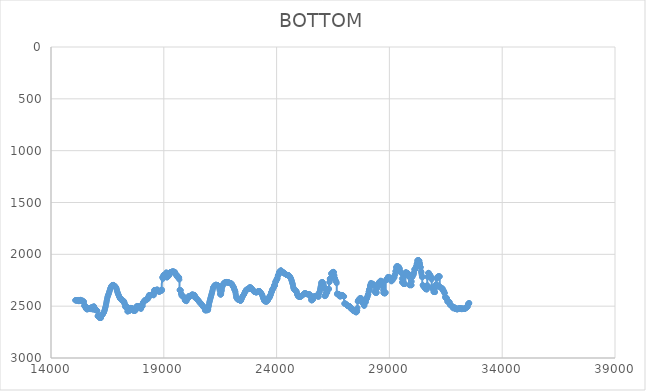
| Category | BOTTOM |
|---|---|
| 15075.3072 | 2442.53 |
| 15082.4409 | 2443.89 |
| 15092.6804 | 2443.94 |
| 15102.9205 | 2443.94 |
| 15113.1605 | 2443.94 |
| 15123.4005 | 2443.94 |
| 15133.6406 | 2443.94 |
| 15143.8806 | 2443.94 |
| 15154.1207 | 2443.94 |
| 15164.3607 | 2442.56 |
| 15174.6007 | 2442.53 |
| 15184.8408 | 2448.04 |
| 15195.0808 | 2446.78 |
| 15205.3209 | 2439.87 |
| 15215.5609 | 2442.47 |
| 15225.8009 | 2445.28 |
| 15236.041 | 2452.23 |
| 15246.281 | 2451.01 |
| 15256.5211 | 2444.09 |
| 15266.7611 | 2443.94 |
| 15277.0011 | 2446.69 |
| 15287.2412 | 2445.38 |
| 15297.4812 | 2445.35 |
| 15307.7213 | 2438.46 |
| 15317.9613 | 2441.06 |
| 15328.2013 | 2446.63 |
| 15338.4414 | 2446.75 |
| 15348.6814 | 2452.26 |
| 15358.9215 | 2446.88 |
| 15369.1615 | 2446.75 |
| 15379.4016 | 2449.51 |
| 15389.6416 | 2445.44 |
| 15399.8816 | 2448.1 |
| 15410.1217 | 2449.54 |
| 15420.3617 | 2453.7 |
| 15430.6018 | 2460.67 |
| 15440.8418 | 2456.7 |
| 15451.0818 | 2456.61 |
| 15461.3219 | 2456.61 |
| 15471.5619 | 2496.52 |
| 15481.802 | 2498.8 |
| 15492.042 | 2493.33 |
| 15502.282 | 2494.58 |
| 15512.5221 | 2494.61 |
| 15522.7621 | 2509.75 |
| 15533.0022 | 2510.1 |
| 15543.2422 | 2516.98 |
| 15553.4822 | 2524.02 |
| 15563.7223 | 2526.93 |
| 15573.9623 | 2526.99 |
| 15584.2024 | 2528.36 |
| 15594.4424 | 2529.77 |
| 15604.6824 | 2532.56 |
| 15614.9225 | 2525.74 |
| 15625.1625 | 2528.33 |
| 15635.4026 | 2522.89 |
| 15645.6426 | 2522.76 |
| 15655.8826 | 2522.76 |
| 15666.1227 | 2520.01 |
| 15676.3627 | 2525.46 |
| 15686.6028 | 2524.2 |
| 15696.8428 | 2522.8 |
| 15707.0828 | 2521.39 |
| 15717.3229 | 2524.11 |
| 15727.5629 | 2525.55 |
| 15737.803 | 2525.58 |
| 15748.043 | 2526.96 |
| 15758.283 | 2528.36 |
| 15768.5231 | 2521.51 |
| 15778.7631 | 2515.85 |
| 15789.0032 | 2510.22 |
| 15799.2432 | 2512.85 |
| 15809.4833 | 2514.29 |
| 15819.7233 | 2514.32 |
| 15829.9633 | 2514.32 |
| 15840.2034 | 2530.84 |
| 15850.4434 | 2531.21 |
| 15860.6835 | 2507.81 |
| 15870.9235 | 2507.28 |
| 15881.1635 | 2519.67 |
| 15891.4036 | 2503.43 |
| 15901.6436 | 2503.06 |
| 15911.8837 | 2503.06 |
| 15922.1237 | 2527.84 |
| 15932.3637 | 2528.4 |
| 15942.6038 | 2536.66 |
| 15952.8438 | 2531.33 |
| 15963.0839 | 2531.21 |
| 15973.3239 | 2531.21 |
| 15983.5639 | 2531.21 |
| 15993.804 | 2533.96 |
| 16004.044 | 2534.03 |
| 16014.2841 | 2538.16 |
| 16024.5241 | 2542.38 |
| 16034.7641 | 2542.47 |
| 16045.0042 | 2542.47 |
| 16055.2442 | 2549.35 |
| 16065.4843 | 2594.94 |
| 16075.7243 | 2595.96 |
| 16085.9643 | 2595.96 |
| 16096.2044 | 2595.96 |
| 16106.4444 | 2598.71 |
| 16116.6845 | 2598.78 |
| 16126.9245 | 2598.78 |
| 16137.1645 | 2600.15 |
| 16147.4046 | 2602.94 |
| 16157.6446 | 2614.01 |
| 16167.8847 | 2614.26 |
| 16178.1247 | 2612.88 |
| 16188.3647 | 2612.85 |
| 16198.6048 | 2612.85 |
| 16208.8448 | 2612.85 |
| 16219.0849 | 2612.85 |
| 16229.3249 | 2592.2 |
| 16239.5649 | 2591.74 |
| 16249.805 | 2591.74 |
| 16260.045 | 2587.61 |
| 16270.2851 | 2586.14 |
| 16280.5251 | 2582.57 |
| 16290.7652 | 2578.95 |
| 16301.0052 | 2575.33 |
| 16311.2452 | 2571.71 |
| 16321.4853 | 2568.09 |
| 16331.7253 | 2564.47 |
| 16341.9654 | 2560.85 |
| 16352.2054 | 2554.8 |
| 16362.4454 | 2548.7 |
| 16372.6855 | 2542.6 |
| 16382.9255 | 2534.21 |
| 16393.1656 | 2525.76 |
| 16403.4056 | 2517.32 |
| 16413.6456 | 2508.87 |
| 16423.8857 | 2500.43 |
| 16434.1257 | 2488.88 |
| 16444.3658 | 2477.27 |
| 16454.6058 | 2465.66 |
| 16464.8458 | 2454.04 |
| 16475.0859 | 2443.12 |
| 16485.3259 | 2432.21 |
| 16495.566 | 2421.3 |
| 16505.806 | 2410.39 |
| 16516.046 | 2404.37 |
| 16526.2861 | 2398.46 |
| 16536.5261 | 2392.55 |
| 16546.7662 | 2386.64 |
| 16557.0062 | 2380.72 |
| 16567.2462 | 2373.71 |
| 16577.4863 | 2366.67 |
| 16587.7263 | 2359.63 |
| 16597.9664 | 2352.25 |
| 16608.2064 | 2344.86 |
| 16618.4464 | 2337.47 |
| 16628.6865 | 2330.08 |
| 16638.9265 | 2325.33 |
| 16649.1666 | 2320.64 |
| 16659.4066 | 2315.95 |
| 16669.6467 | 2311.26 |
| 16679.8867 | 2306.56 |
| 16690.1267 | 2301.87 |
| 16700.3668 | 2300.79 |
| 16710.6068 | 2299.78 |
| 16720.8469 | 2298.77 |
| 16731.0869 | 2297.77 |
| 16741.3269 | 2296.76 |
| 16751.567 | 2295.76 |
| 16761.807 | 2294.75 |
| 16772.0471 | 2296.45 |
| 16782.2871 | 2298.21 |
| 16792.5271 | 2299.97 |
| 16802.7672 | 2301.73 |
| 16813.0072 | 2303.49 |
| 16823.2473 | 2305.25 |
| 16833.4873 | 2307.01 |
| 16843.7273 | 2308.77 |
| 16853.9674 | 2311.84 |
| 16864.2074 | 2314.93 |
| 16874.4475 | 2318.03 |
| 16884.6875 | 2321.13 |
| 16894.9275 | 2324.22 |
| 16905.1676 | 2332.55 |
| 16915.4076 | 2341 |
| 16925.6477 | 2349.45 |
| 16935.8877 | 2356.97 |
| 16946.1277 | 2364.48 |
| 16956.3678 | 2371.99 |
| 16966.6078 | 2377.43 |
| 16976.8479 | 2382.82 |
| 16987.0879 | 2388.22 |
| 16997.3279 | 2393.62 |
| 17007.568 | 2399.01 |
| 17017.808 | 2404.41 |
| 17028.0481 | 2409.21 |
| 17038.2881 | 2413.99 |
| 17048.5282 | 2418.78 |
| 17058.7682 | 2423.57 |
| 17069.0082 | 2428.35 |
| 17079.2483 | 2428.45 |
| 17089.4883 | 2428.45 |
| 17099.7284 | 2428.45 |
| 17109.9684 | 2428.45 |
| 17120.2084 | 2428.45 |
| 17130.4485 | 2442.23 |
| 17140.6885 | 2442.53 |
| 17150.9286 | 2446.66 |
| 17161.1686 | 2445.38 |
| 17171.4086 | 2445.35 |
| 17181.6487 | 2445.35 |
| 17191.8887 | 2445.35 |
| 17202.1288 | 2448.1 |
| 17212.3688 | 2449.54 |
| 17222.6088 | 2449.57 |
| 17232.8489 | 2467.47 |
| 17243.0889 | 2467.87 |
| 17253.329 | 2459.6 |
| 17263.569 | 2477.33 |
| 17273.809 | 2477.72 |
| 17284.0491 | 2498.38 |
| 17294.2891 | 2508.48 |
| 17304.5292 | 2508.69 |
| 17314.7692 | 2507.31 |
| 17325.0092 | 2507.28 |
| 17335.2493 | 2508.66 |
| 17345.4893 | 2504.56 |
| 17355.7294 | 2512.73 |
| 17365.9694 | 2512.91 |
| 17376.2094 | 2504.65 |
| 17386.4495 | 2549.92 |
| 17396.6895 | 2550.92 |
| 17406.9296 | 2549.54 |
| 17417.1696 | 2548.13 |
| 17427.4097 | 2545.35 |
| 17437.6497 | 2545.29 |
| 17447.8897 | 2545.29 |
| 17458.1298 | 2546.66 |
| 17468.3698 | 2546.69 |
| 17478.6099 | 2524.66 |
| 17488.8499 | 2522.79 |
| 17499.0899 | 2521.39 |
| 17509.33 | 2519.98 |
| 17519.57 | 2519.95 |
| 17529.8101 | 2517.19 |
| 17540.0501 | 2517.13 |
| 17550.2901 | 2517.13 |
| 17560.5302 | 2518.51 |
| 17570.7702 | 2519.92 |
| 17581.0103 | 2519.95 |
| 17591.2503 | 2519.95 |
| 17601.4903 | 2522.7 |
| 17611.7304 | 2522.76 |
| 17621.9704 | 2537.92 |
| 17632.2105 | 2538.25 |
| 17642.4505 | 2538.25 |
| 17652.6905 | 2542.38 |
| 17662.9306 | 2543.85 |
| 17673.1706 | 2543.88 |
| 17683.4107 | 2543.88 |
| 17693.6507 | 2545.26 |
| 17703.8907 | 2545.29 |
| 17714.1308 | 2539.78 |
| 17724.3708 | 2541.03 |
| 17734.6109 | 2541.06 |
| 17744.8509 | 2542.44 |
| 17755.091 | 2512.17 |
| 17765.331 | 2511.5 |
| 17775.571 | 2511.5 |
| 17785.8111 | 2508.75 |
| 17796.0511 | 2508.69 |
| 17806.2912 | 2497.67 |
| 17816.5312 | 2509.83 |
| 17826.7712 | 2510.1 |
| 17837.0113 | 2501.83 |
| 17847.2513 | 2498.9 |
| 17857.4914 | 2498.84 |
| 17867.7314 | 2498.84 |
| 17877.9714 | 2501.59 |
| 17888.2115 | 2498.9 |
| 17898.4515 | 2498.84 |
| 17908.6916 | 2501.59 |
| 17918.9316 | 2514.05 |
| 17929.1716 | 2515.7 |
| 17939.4117 | 2515.73 |
| 17949.6517 | 2517.1 |
| 17959.8918 | 2519.89 |
| 17970.1318 | 2519.95 |
| 17980.3718 | 2519.95 |
| 17990.6119 | 2526.84 |
| 18000.8519 | 2507.7 |
| 18011.092 | 2508.66 |
| 18021.332 | 2505.93 |
| 18031.572 | 2498.98 |
| 18041.8121 | 2501.59 |
| 18052.0521 | 2501.65 |
| 18062.2922 | 2496.14 |
| 18072.5322 | 2465.71 |
| 18082.7723 | 2462.3 |
| 18093.0123 | 2464.99 |
| 18103.2523 | 2465.05 |
| 18113.4924 | 2458.16 |
| 18123.7324 | 2452.5 |
| 18133.9725 | 2451.01 |
| 18144.2125 | 2445.47 |
| 18154.4525 | 2443.97 |
| 18164.6926 | 2443.94 |
| 18174.9326 | 2441.18 |
| 18185.1727 | 2441.12 |
| 18195.4127 | 2441.12 |
| 18205.6527 | 2436.99 |
| 18215.8928 | 2436.9 |
| 18226.1328 | 2436.9 |
| 18236.3729 | 2436.9 |
| 18246.6129 | 2436.9 |
| 18256.8529 | 2434.14 |
| 18267.093 | 2434.08 |
| 18277.333 | 2432.71 |
| 18287.5731 | 2432.68 |
| 18297.8131 | 2421.65 |
| 18308.0531 | 2410.39 |
| 18318.2932 | 2412.91 |
| 18328.5332 | 2412.97 |
| 18338.7733 | 2395.06 |
| 18349.0133 | 2393.29 |
| 18359.2533 | 2394.64 |
| 18369.4934 | 2394.67 |
| 18379.7334 | 2394.67 |
| 18389.9735 | 2397.43 |
| 18400.2135 | 2397.49 |
| 18410.4536 | 2398.86 |
| 18420.6936 | 2392.01 |
| 18430.9336 | 2391.86 |
| 18441.1737 | 2393.23 |
| 18451.4137 | 2390.51 |
| 18461.6538 | 2390.45 |
| 18471.8938 | 2389.07 |
| 18482.1338 | 2389.04 |
| 18492.3739 | 2390.42 |
| 18502.6139 | 2390.45 |
| 18512.854 | 2390.45 |
| 18523.094 | 2390.45 |
| 18533.334 | 2389.07 |
| 18543.5741 | 2394.55 |
| 18553.8141 | 2394.67 |
| 18564.0542 | 2362.98 |
| 18574.2942 | 2345.76 |
| 18584.5342 | 2345.41 |
| 18594.7743 | 2345.41 |
| 18605.0143 | 2345.41 |
| 18615.2544 | 2344.03 |
| 18625.4944 | 2344 |
| 18635.7344 | 2359.16 |
| 18645.9745 | 2359.48 |
| 18656.2145 | 2359.48 |
| 18666.4546 | 2356.73 |
| 18676.6946 | 2341.51 |
| 18686.9347 | 2341.18 |
| 18697.1747 | 2342.56 |
| 18707.4147 | 2342.59 |
| 18717.6548 | 2341.21 |
| 18727.8948 | 2341.18 |
| 18738.1349 | 2354.96 |
| 18748.3749 | 2356.64 |
| 18758.6149 | 2353.91 |
| 18768.855 | 2353.85 |
| 18779.095 | 2353.85 |
| 18789.3351 | 2360.74 |
| 18799.5751 | 2360.89 |
| 18809.8151 | 2360.89 |
| 18820.0552 | 2356.75 |
| 18830.2952 | 2352.53 |
| 18840.5353 | 2352.44 |
| 18850.7753 | 2352.44 |
| 18861.0153 | 2348.31 |
| 18871.2554 | 2348.22 |
| 18881.4954 | 2348.22 |
| 18891.7355 | 2349.6 |
| 18901.9755 | 2349.63 |
| 18912.2155 | 2349.63 |
| 18922.4556 | 2339.98 |
| 18932.6956 | 2224.01 |
| 18942.9357 | 2221.53 |
| 18953.1757 | 2221.53 |
| 18963.4158 | 2236.69 |
| 18973.6558 | 2210.83 |
| 18983.8958 | 2200.63 |
| 18994.1359 | 2200.42 |
| 19004.3759 | 2200.42 |
| 19014.616 | 2199.04 |
| 19024.856 | 2199.01 |
| 19035.096 | 2200.39 |
| 19045.3361 | 2208.69 |
| 19055.5761 | 2208.87 |
| 19065.8162 | 2208.87 |
| 19076.0562 | 2211.62 |
| 19086.2962 | 2211.68 |
| 19096.5363 | 2211.68 |
| 19106.7763 | 2175.85 |
| 19117.0164 | 2175.08 |
| 19127.2564 | 2220.56 |
| 19137.4964 | 2221.53 |
| 19147.7365 | 2221.53 |
| 19157.9765 | 2221.53 |
| 19168.2166 | 2211.89 |
| 19178.4566 | 2210.3 |
| 19188.6966 | 2210.27 |
| 19198.9367 | 2210.27 |
| 19209.1767 | 2210.27 |
| 19219.4168 | 2200.63 |
| 19229.6568 | 2203.18 |
| 19239.8969 | 2203.24 |
| 19250.1369 | 2178.43 |
| 19260.3769 | 2177.9 |
| 19270.617 | 2176.52 |
| 19280.857 | 2175.11 |
| 19291.0971 | 2173.71 |
| 19301.3371 | 2173.68 |
| 19311.5771 | 2173.68 |
| 19321.8172 | 2172.3 |
| 19332.0572 | 2172.27 |
| 19342.2973 | 2169.51 |
| 19352.5373 | 2168.07 |
| 19362.7773 | 2168.05 |
| 19373.0174 | 2166.67 |
| 19383.2574 | 2166.64 |
| 19393.4975 | 2166.64 |
| 19403.7375 | 2166.64 |
| 19413.9775 | 2166.64 |
| 19424.2176 | 2166.64 |
| 19434.4576 | 2168.02 |
| 19444.6977 | 2168.05 |
| 19454.9377 | 2168.05 |
| 19465.1777 | 2168.05 |
| 19475.4178 | 2170.8 |
| 19485.6578 | 2170.86 |
| 19495.8979 | 2170.86 |
| 19506.1379 | 2192.92 |
| 19516.378 | 2190.63 |
| 19526.618 | 2191.95 |
| 19536.858 | 2191.97 |
| 19547.0981 | 2194.73 |
| 19557.3381 | 2194.79 |
| 19567.5782 | 2196.17 |
| 19577.8182 | 2214.12 |
| 19588.0582 | 2213.12 |
| 19598.2983 | 2213.09 |
| 19608.5383 | 2213.09 |
| 19618.7784 | 2214.47 |
| 19629.0184 | 2214.5 |
| 19639.2584 | 2214.5 |
| 19649.4985 | 2220.01 |
| 19659.7385 | 2233.91 |
| 19669.9786 | 2223.18 |
| 19680.2186 | 2222.94 |
| 19690.4586 | 2243.62 |
| 19700.6987 | 2343.31 |
| 19710.9387 | 2345.41 |
| 19721.1788 | 2346.78 |
| 19731.4188 | 2346.81 |
| 19741.6588 | 2346.81 |
| 19751.8989 | 2348.19 |
| 19762.1389 | 2378.55 |
| 19772.379 | 2379.19 |
| 19782.619 | 2395.73 |
| 19792.8591 | 2396.08 |
| 19803.0991 | 2393.32 |
| 19813.3391 | 2402.91 |
| 19823.5792 | 2403.12 |
| 19833.8192 | 2401.74 |
| 19844.0593 | 2401.71 |
| 19854.2993 | 2404.47 |
| 19864.5393 | 2411.42 |
| 19874.7794 | 2411.56 |
| 19885.0194 | 2411.56 |
| 19895.2595 | 2415.7 |
| 19905.4995 | 2414.41 |
| 19915.7395 | 2422.65 |
| 19925.9796 | 2435.23 |
| 19936.2196 | 2443.76 |
| 19946.4597 | 2443.94 |
| 19956.6997 | 2443.94 |
| 19966.9397 | 2445.32 |
| 19977.1798 | 2448.1 |
| 19987.4198 | 2448.16 |
| 19997.6599 | 2448.16 |
| 20007.8999 | 2452.3 |
| 20018.14 | 2424.81 |
| 20028.38 | 2424.23 |
| 20038.62 | 2424.23 |
| 20048.8601 | 2424.23 |
| 20059.1001 | 2424.23 |
| 20069.3402 | 2424.23 |
| 20079.5802 | 2420.1 |
| 20089.8202 | 2420.01 |
| 20100.0603 | 2420.01 |
| 20110.3003 | 2402.09 |
| 20120.5404 | 2401.71 |
| 20130.7804 | 2401.71 |
| 20141.0204 | 2404.47 |
| 20151.2605 | 2404.53 |
| 20161.5005 | 2403.15 |
| 20171.7406 | 2403.12 |
| 20181.9806 | 2401.74 |
| 20192.2206 | 2401.71 |
| 20202.4607 | 2400.33 |
| 20212.7007 | 2396.17 |
| 20222.9408 | 2390.56 |
| 20233.1808 | 2390.45 |
| 20243.4208 | 2389.07 |
| 20253.6609 | 2389.04 |
| 20263.9009 | 2390.42 |
| 20274.141 | 2390.45 |
| 20284.381 | 2389.07 |
| 20294.6211 | 2389.04 |
| 20304.8611 | 2389.04 |
| 20315.1011 | 2393.18 |
| 20325.3412 | 2393.26 |
| 20335.5812 | 2391.89 |
| 20345.8213 | 2391.86 |
| 20356.0613 | 2391.86 |
| 20366.3013 | 2415.3 |
| 20376.5414 | 2397.86 |
| 20386.7814 | 2408.52 |
| 20397.0215 | 2410.13 |
| 20407.2615 | 2410.16 |
| 20417.5015 | 2421.19 |
| 20427.7416 | 2421.42 |
| 20437.9816 | 2421.42 |
| 20448.2217 | 2429.69 |
| 20458.4617 | 2429.86 |
| 20468.7017 | 2429.86 |
| 20478.9418 | 2436.76 |
| 20489.1818 | 2436.9 |
| 20499.4219 | 2438.28 |
| 20509.6619 | 2443.82 |
| 20519.902 | 2443.94 |
| 20530.142 | 2443.94 |
| 20540.382 | 2445.32 |
| 20550.6221 | 2453.62 |
| 20560.8621 | 2457.93 |
| 20571.1022 | 2458.01 |
| 20581.3422 | 2458.01 |
| 20591.5822 | 2466.29 |
| 20601.8223 | 2466.46 |
| 20612.0623 | 2466.46 |
| 20622.3024 | 2466.46 |
| 20632.5424 | 2473.35 |
| 20642.7824 | 2473.5 |
| 20653.0225 | 2477.64 |
| 20663.2625 | 2477.72 |
| 20673.5026 | 2481.86 |
| 20683.7426 | 2487.46 |
| 20693.9826 | 2488.95 |
| 20704.2227 | 2488.98 |
| 20714.4627 | 2497.26 |
| 20724.7028 | 2500.19 |
| 20734.9428 | 2500.24 |
| 20745.1828 | 2507.14 |
| 20755.4229 | 2507.28 |
| 20765.6629 | 2507.28 |
| 20775.903 | 2512.8 |
| 20786.143 | 2511.53 |
| 20796.3831 | 2511.5 |
| 20806.6231 | 2511.5 |
| 20816.8631 | 2517.02 |
| 20827.1032 | 2539.2 |
| 20837.3432 | 2539.66 |
| 20847.5833 | 2539.66 |
| 20857.8233 | 2539.66 |
| 20868.0633 | 2539.66 |
| 20878.3034 | 2538.28 |
| 20888.5434 | 2538.25 |
| 20898.7835 | 2538.25 |
| 20909.0235 | 2538.25 |
| 20919.2635 | 2538.25 |
| 20929.5036 | 2538.25 |
| 20939.7436 | 2538.25 |
| 20949.9837 | 2538.25 |
| 20960.2237 | 2538.25 |
| 20970.4637 | 2528.59 |
| 20980.7038 | 2509.09 |
| 20990.9438 | 2499.03 |
| 21001.1839 | 2489.18 |
| 21011.4239 | 2471.05 |
| 21021.664 | 2462.06 |
| 21031.904 | 2453.27 |
| 21042.144 | 2444.47 |
| 21052.3841 | 2435.67 |
| 21062.6241 | 2427.56 |
| 21072.8642 | 2419.47 |
| 21083.1042 | 2411.37 |
| 21093.3442 | 2403.28 |
| 21103.5843 | 2395.07 |
| 21113.8243 | 2386.86 |
| 21124.0644 | 2378.65 |
| 21134.3044 | 2370.44 |
| 21144.5444 | 2362.23 |
| 21154.7845 | 2354.02 |
| 21165.0245 | 2343.28 |
| 21175.2646 | 2332.49 |
| 21185.5046 | 2321.69 |
| 21195.7446 | 2318.26 |
| 21205.9847 | 2314.97 |
| 21216.2247 | 2311.69 |
| 21226.4648 | 2308.4 |
| 21236.7048 | 2305.12 |
| 21246.9449 | 2301.84 |
| 21257.1849 | 2300.11 |
| 21267.4249 | 2298.42 |
| 21277.665 | 2296.74 |
| 21287.905 | 2295.05 |
| 21298.1451 | 2293.36 |
| 21308.3851 | 2293.84 |
| 21318.6251 | 2294.37 |
| 21328.8652 | 2294.9 |
| 21339.1052 | 2295.42 |
| 21349.3453 | 2295.95 |
| 21359.5853 | 2296.48 |
| 21369.8253 | 2297.01 |
| 21380.0654 | 2297.54 |
| 21390.3054 | 2299.39 |
| 21400.5455 | 2301.26 |
| 21410.7855 | 2303.14 |
| 21421.0255 | 2306.28 |
| 21431.2656 | 2309.45 |
| 21441.5056 | 2312.61 |
| 21451.7457 | 2315.78 |
| 21461.9857 | 2331.02 |
| 21472.2258 | 2342.36 |
| 21482.4658 | 2353.62 |
| 21492.7058 | 2378.68 |
| 21502.9459 | 2386.08 |
| 21513.1859 | 2387.61 |
| 21523.426 | 2387.63 |
| 21533.666 | 2387.63 |
| 21543.906 | 2380.74 |
| 21554.1461 | 2358.53 |
| 21564.3861 | 2351.18 |
| 21574.6262 | 2338.62 |
| 21584.8662 | 2320.43 |
| 21595.1062 | 2310.41 |
| 21605.3463 | 2300.56 |
| 21615.5863 | 2301.74 |
| 21625.8264 | 2290.73 |
| 21636.0664 | 2290.51 |
| 21646.3065 | 2283.61 |
| 21656.5465 | 2280.71 |
| 21666.7865 | 2280.65 |
| 21677.0266 | 2275.14 |
| 21687.2666 | 2273.64 |
| 21697.5067 | 2272.24 |
| 21707.7467 | 2272.21 |
| 21717.9867 | 2272.21 |
| 21728.2268 | 2271.75 |
| 21738.4668 | 2271.28 |
| 21748.7069 | 2270.81 |
| 21758.9469 | 2268.73 |
| 21769.1869 | 2266.62 |
| 21779.427 | 2266.58 |
| 21789.667 | 2267.96 |
| 21799.9071 | 2269.37 |
| 21810.1471 | 2269.85 |
| 21820.3871 | 2270.32 |
| 21830.6272 | 2270.79 |
| 21840.8672 | 2272.18 |
| 21851.1073 | 2272.21 |
| 21861.3473 | 2272.21 |
| 21871.5874 | 2272.21 |
| 21881.8274 | 2272.21 |
| 21892.0674 | 2273.59 |
| 21902.3075 | 2274.08 |
| 21912.5475 | 2274.55 |
| 21922.7876 | 2275.01 |
| 21933.0276 | 2276.17 |
| 21943.2676 | 2277.35 |
| 21953.5077 | 2278.52 |
| 21963.7477 | 2279.69 |
| 21973.9878 | 2280.87 |
| 21984.2278 | 2282.04 |
| 21994.4678 | 2282.06 |
| 22004.7079 | 2282.06 |
| 22014.9479 | 2286.2 |
| 22025.188 | 2290.42 |
| 22035.428 | 2294.65 |
| 22045.668 | 2299.56 |
| 22055.9081 | 2304.49 |
| 22066.1481 | 2311.48 |
| 22076.3882 | 2311.62 |
| 22086.6282 | 2311.62 |
| 22096.8683 | 2317.14 |
| 22107.1083 | 2322.77 |
| 22117.3483 | 2330.47 |
| 22127.5884 | 2338.21 |
| 22137.8284 | 2343.2 |
| 22148.0685 | 2348.12 |
| 22158.3085 | 2353.05 |
| 22168.5485 | 2357.98 |
| 22178.7886 | 2369.11 |
| 22189.0286 | 2385.89 |
| 22199.2687 | 2399.33 |
| 22209.5087 | 2412.71 |
| 22219.7487 | 2417.11 |
| 22229.9888 | 2421.33 |
| 22240.2288 | 2425.56 |
| 22250.4689 | 2428.86 |
| 22260.7089 | 2432.14 |
| 22270.949 | 2435.43 |
| 22281.189 | 2434.8 |
| 22291.429 | 2434.1 |
| 22301.6691 | 2435.29 |
| 22311.9091 | 2436.52 |
| 22322.1492 | 2437.76 |
| 22332.3892 | 2438.99 |
| 22342.6292 | 2440.22 |
| 22352.8693 | 2441.45 |
| 22363.1093 | 2442.68 |
| 22373.3494 | 2443.91 |
| 22383.5894 | 2444.97 |
| 22393.8294 | 2446.03 |
| 22404.0695 | 2447.08 |
| 22414.3095 | 2448.14 |
| 22424.5496 | 2442.64 |
| 22434.7896 | 2437.01 |
| 22445.0296 | 2431.38 |
| 22455.2697 | 2425.75 |
| 22465.5097 | 2420.12 |
| 22475.7498 | 2413.8 |
| 22485.9898 | 2407.47 |
| 22496.2299 | 2404.19 |
| 22506.4699 | 2400.97 |
| 22516.7099 | 2397.75 |
| 22526.95 | 2394.53 |
| 22537.19 | 2391.32 |
| 22547.4301 | 2388.1 |
| 22557.6701 | 2384.88 |
| 22567.9101 | 2379.3 |
| 22578.1502 | 2373.67 |
| 22588.3902 | 2368.04 |
| 22598.6303 | 2362.41 |
| 22608.8703 | 2358.5 |
| 22619.1103 | 2354.63 |
| 22629.3504 | 2350.76 |
| 22639.5904 | 2346.89 |
| 22649.8305 | 2344.51 |
| 22660.0705 | 2342.17 |
| 22670.3106 | 2339.82 |
| 22680.5506 | 2339.22 |
| 22690.7906 | 2338.66 |
| 22701.0307 | 2338.1 |
| 22711.2707 | 2337.53 |
| 22721.5108 | 2336.97 |
| 22731.7508 | 2335.92 |
| 22741.9908 | 2334.87 |
| 22752.2309 | 2333.81 |
| 22762.4709 | 2332.76 |
| 22772.711 | 2328.6 |
| 22782.951 | 2324.37 |
| 22793.191 | 2320.15 |
| 22803.4311 | 2319.79 |
| 22813.6711 | 2319.51 |
| 22823.9112 | 2319.23 |
| 22834.1512 | 2318.95 |
| 22844.3912 | 2318.67 |
| 22854.6313 | 2321.19 |
| 22864.8713 | 2323.77 |
| 22875.1114 | 2326.35 |
| 22885.3514 | 2328.93 |
| 22895.5915 | 2331.51 |
| 22905.8315 | 2334.09 |
| 22916.0715 | 2336.63 |
| 22926.3116 | 2339.16 |
| 22936.5516 | 2341.7 |
| 22946.7917 | 2344.23 |
| 22957.0317 | 2346.76 |
| 22967.2717 | 2350.49 |
| 22977.5118 | 2354.25 |
| 22987.7518 | 2358 |
| 22997.9919 | 2358.76 |
| 23008.2319 | 2359.47 |
| 23018.4719 | 2360.17 |
| 23028.712 | 2360.88 |
| 23038.952 | 2361.58 |
| 23049.1921 | 2362.28 |
| 23059.4321 | 2363.4 |
| 23069.6722 | 2364.53 |
| 23079.9122 | 2365.65 |
| 23090.1522 | 2366.78 |
| 23100.3923 | 2367.91 |
| 23110.6323 | 2366.55 |
| 23120.8724 | 2365.14 |
| 23131.1124 | 2363.73 |
| 23141.3524 | 2362.32 |
| 23151.5925 | 2360.92 |
| 23161.8325 | 2359.51 |
| 23172.0726 | 2358.1 |
| 23182.3126 | 2356.69 |
| 23192.5526 | 2355.29 |
| 23202.7927 | 2355.26 |
| 23213.0327 | 2355.26 |
| 23223.2728 | 2355.26 |
| 23233.5128 | 2355.26 |
| 23243.7529 | 2355.26 |
| 23253.9929 | 2358.17 |
| 23264.2329 | 2361.14 |
| 23274.473 | 2364.12 |
| 23284.713 | 2367.09 |
| 23294.9531 | 2370.06 |
| 23305.1931 | 2373.03 |
| 23315.4331 | 2376 |
| 23325.6732 | 2378.97 |
| 23335.9132 | 2381.95 |
| 23346.1533 | 2386.14 |
| 23356.3933 | 2390.37 |
| 23366.6333 | 2394.59 |
| 23376.8734 | 2402.49 |
| 23387.1134 | 2410.47 |
| 23397.3535 | 2418.45 |
| 23407.5935 | 2422.28 |
| 23417.8335 | 2426.04 |
| 23428.0736 | 2429.79 |
| 23438.3136 | 2438.14 |
| 23448.5537 | 2446.59 |
| 23458.7937 | 2450.89 |
| 23469.0338 | 2450.98 |
| 23479.2738 | 2452.36 |
| 23489.5138 | 2451 |
| 23499.7539 | 2452.36 |
| 23509.9939 | 2455.14 |
| 23520.234 | 2455.2 |
| 23530.474 | 2453.82 |
| 23540.714 | 2455.17 |
| 23550.9541 | 2452.44 |
| 23561.1941 | 2455.14 |
| 23571.4342 | 2455.2 |
| 23581.6742 | 2440.01 |
| 23591.9142 | 2438.34 |
| 23602.1543 | 2436.93 |
| 23612.3943 | 2443.8 |
| 23622.6344 | 2441.18 |
| 23632.8744 | 2434.22 |
| 23643.1145 | 2428.56 |
| 23653.3545 | 2427.07 |
| 23663.5945 | 2411.86 |
| 23673.8346 | 2411.56 |
| 23684.0746 | 2410.18 |
| 23694.3147 | 2410.16 |
| 23704.5547 | 2412.92 |
| 23714.7947 | 2393.64 |
| 23725.0348 | 2397.41 |
| 23735.2748 | 2390.58 |
| 23745.5149 | 2384.93 |
| 23755.7549 | 2365.49 |
| 23765.9949 | 2367.87 |
| 23776.235 | 2363.79 |
| 23786.475 | 2363.7 |
| 23796.7151 | 2341.62 |
| 23806.9551 | 2346.7 |
| 23817.1952 | 2342.67 |
| 23827.4352 | 2335.69 |
| 23837.6752 | 2334.17 |
| 23847.9153 | 2325.86 |
| 23858.1553 | 2325.7 |
| 23868.3954 | 2321.56 |
| 23878.6354 | 2314.57 |
| 23888.8754 | 2297.87 |
| 23899.1155 | 2300.31 |
| 23909.3555 | 2301.74 |
| 23919.5956 | 2299.01 |
| 23929.8356 | 2300.33 |
| 23940.0756 | 2264.47 |
| 23950.3157 | 2266.52 |
| 23960.5557 | 2266.58 |
| 23970.7958 | 2262.44 |
| 23981.0358 | 2256.83 |
| 23991.2759 | 2242.92 |
| 24001.5159 | 2248.17 |
| 24011.7559 | 2244.14 |
| 24021.996 | 2234.39 |
| 24032.236 | 2227.3 |
| 24042.4761 | 2232.69 |
| 24052.7161 | 2207.94 |
| 24062.9561 | 2201.94 |
| 24073.1962 | 2199.07 |
| 24083.4362 | 2197.63 |
| 24093.6763 | 2197.61 |
| 24103.9163 | 2175.51 |
| 24114.1563 | 2170.94 |
| 24124.3964 | 2169.48 |
| 24134.6364 | 2174.98 |
| 24144.8765 | 2168.18 |
| 24155.1165 | 2161.14 |
| 24165.3566 | 2158.25 |
| 24175.5966 | 2156.81 |
| 24185.8366 | 2156.78 |
| 24196.0767 | 2155.4 |
| 24206.3167 | 2156.76 |
| 24216.5568 | 2159.55 |
| 24226.7968 | 2163.74 |
| 24237.0368 | 2165.2 |
| 24247.2769 | 2169.37 |
| 24257.5169 | 2170.83 |
| 24267.757 | 2175 |
| 24277.997 | 2175.08 |
| 24288.237 | 2175.08 |
| 24298.4771 | 2175.08 |
| 24308.7171 | 2175.08 |
| 24318.9572 | 2177.85 |
| 24329.1972 | 2177.9 |
| 24339.4373 | 2177.9 |
| 24349.6773 | 2184.8 |
| 24359.9173 | 2186.32 |
| 24370.1574 | 2187.73 |
| 24380.3974 | 2189.13 |
| 24390.6375 | 2190.54 |
| 24400.8775 | 2191.95 |
| 24411.1175 | 2193.36 |
| 24421.3576 | 2194.76 |
| 24431.5976 | 2196.17 |
| 24441.8377 | 2197.58 |
| 24452.0777 | 2198.16 |
| 24462.3177 | 2198.72 |
| 24472.5578 | 2199.28 |
| 24482.7978 | 2199.85 |
| 24493.0379 | 2200.41 |
| 24503.2779 | 2200.97 |
| 24513.518 | 2201.54 |
| 24523.758 | 2202.1 |
| 24533.998 | 2202.66 |
| 24544.2381 | 2203.23 |
| 24554.4781 | 2206.39 |
| 24564.7182 | 2209.61 |
| 24574.9582 | 2212.83 |
| 24585.1982 | 2216.04 |
| 24595.4383 | 2219.26 |
| 24605.6783 | 2222.48 |
| 24615.9184 | 2225.7 |
| 24626.1584 | 2230.36 |
| 24636.3984 | 2235.05 |
| 24646.6385 | 2239.74 |
| 24656.8785 | 2247.08 |
| 24667.1186 | 2254.47 |
| 24677.3586 | 2261.86 |
| 24687.5987 | 2269.25 |
| 24697.8387 | 2276.76 |
| 24708.0787 | 2284.27 |
| 24718.3188 | 2291.77 |
| 24728.5588 | 2305.73 |
| 24738.7989 | 2316.35 |
| 24749.0389 | 2326.91 |
| 24759.2789 | 2330.42 |
| 24769.519 | 2333.8 |
| 24779.759 | 2337.18 |
| 24789.9991 | 2340.56 |
| 24800.2391 | 2343.93 |
| 24810.4791 | 2345.58 |
| 24820.7192 | 2347.18 |
| 24830.9592 | 2348.79 |
| 24841.1993 | 2350.4 |
| 24851.4393 | 2352.01 |
| 24861.6794 | 2353.62 |
| 24871.9194 | 2355.23 |
| 24882.1594 | 2359.4 |
| 24892.3995 | 2363.62 |
| 24902.6395 | 2380.28 |
| 24912.8796 | 2385.66 |
| 24923.1196 | 2390.82 |
| 24933.3596 | 2395.98 |
| 24943.5997 | 2399.53 |
| 24953.8397 | 2403.05 |
| 24964.0798 | 2405.19 |
| 24974.3198 | 2407.3 |
| 24984.5598 | 2407.8 |
| 24994.7999 | 2408.27 |
| 25005.0399 | 2408.74 |
| 25015.28 | 2409.21 |
| 25025.52 | 2409.68 |
| 25035.7601 | 2410.15 |
| 25046.0001 | 2409.46 |
| 25056.2401 | 2408.76 |
| 25066.4802 | 2407.37 |
| 25076.7202 | 2405.96 |
| 25086.9603 | 2404.55 |
| 25097.2003 | 2403.14 |
| 25107.4403 | 2401.46 |
| 25117.6804 | 2399.77 |
| 25127.9204 | 2398.08 |
| 25138.1605 | 2396.39 |
| 25148.4005 | 2394.7 |
| 25158.6406 | 2392.43 |
| 25168.8806 | 2390.14 |
| 25179.1206 | 2387.85 |
| 25189.3607 | 2385.57 |
| 25199.6007 | 2383.28 |
| 25209.8408 | 2380.99 |
| 25220.0808 | 2378.7 |
| 25230.3208 | 2376.42 |
| 25240.5609 | 2376.72 |
| 25250.8009 | 2377.07 |
| 25261.041 | 2377.42 |
| 25271.281 | 2377.77 |
| 25281.521 | 2378.13 |
| 25291.7611 | 2378.48 |
| 25302.0011 | 2378.83 |
| 25312.2412 | 2379.18 |
| 25322.4812 | 2380.34 |
| 25332.7213 | 2381.51 |
| 25342.9613 | 2382.69 |
| 25353.2013 | 2383.86 |
| 25363.4414 | 2385.03 |
| 25373.6814 | 2386.2 |
| 25383.9215 | 2386.03 |
| 25394.1615 | 2385.83 |
| 25404.4015 | 2385.63 |
| 25414.6416 | 2385.43 |
| 25424.8816 | 2385.22 |
| 25435.1217 | 2385.02 |
| 25445.3617 | 2384.82 |
| 25455.6017 | 2386.55 |
| 25465.8418 | 2388.3 |
| 25476.0818 | 2390.06 |
| 25486.3219 | 2391.82 |
| 25496.5619 | 2398.07 |
| 25506.802 | 2404.41 |
| 25517.042 | 2410.05 |
| 25527.282 | 2425.35 |
| 25537.5221 | 2442.22 |
| 25547.7621 | 2443.22 |
| 25558.0022 | 2443.93 |
| 25568.2422 | 2442.56 |
| 25578.4822 | 2441.15 |
| 25588.7223 | 2439.74 |
| 25598.9623 | 2436.95 |
| 25609.2024 | 2434.14 |
| 25619.4424 | 2429.94 |
| 25629.6824 | 2425.72 |
| 25639.9225 | 2421.49 |
| 25650.1625 | 2414.51 |
| 25660.4026 | 2408.85 |
| 25670.6426 | 2408.75 |
| 25680.8827 | 2404.6 |
| 25691.1227 | 2404.53 |
| 25701.3627 | 2403.14 |
| 25711.6028 | 2403.12 |
| 25721.8428 | 2401.74 |
| 25732.0829 | 2400.33 |
| 25742.3229 | 2400.3 |
| 25752.5629 | 2400.3 |
| 25762.803 | 2401.68 |
| 25773.043 | 2401.71 |
| 25783.2831 | 2401.71 |
| 25793.5231 | 2403.09 |
| 25803.7632 | 2403.12 |
| 25814.0032 | 2404.5 |
| 25824.2432 | 2404.53 |
| 25834.4833 | 2404.53 |
| 25844.7233 | 2404.53 |
| 25854.9634 | 2404.53 |
| 25865.2034 | 2410.05 |
| 25875.4434 | 2381.14 |
| 25885.6835 | 2369.54 |
| 25895.9235 | 2370.72 |
| 25906.1636 | 2365.22 |
| 25916.4036 | 2353.14 |
| 25926.6436 | 2340.94 |
| 25936.8837 | 2328.74 |
| 25947.1237 | 2318.15 |
| 25957.3638 | 2307.59 |
| 25967.6038 | 2291.51 |
| 25977.8439 | 2275.32 |
| 25988.0839 | 2272.72 |
| 25998.3239 | 2270.38 |
| 26008.564 | 2268.03 |
| 26018.804 | 2268.45 |
| 26029.0441 | 2268.92 |
| 26039.2841 | 2269.39 |
| 26049.5241 | 2274 |
| 26059.7642 | 2278.69 |
| 26070.0042 | 2283.38 |
| 26080.2443 | 2293.83 |
| 26090.4843 | 2304.39 |
| 26100.7244 | 2313.33 |
| 26110.9644 | 2322.25 |
| 26121.2044 | 2331.16 |
| 26131.4445 | 2403.18 |
| 26141.6845 | 2399 |
| 26151.9246 | 2398.89 |
| 26162.1646 | 2398.89 |
| 26172.4046 | 2398.89 |
| 26182.6447 | 2387.84 |
| 26192.8847 | 2373.82 |
| 26203.1248 | 2373.56 |
| 26213.3648 | 2373.56 |
| 26223.6048 | 2369.41 |
| 26233.8449 | 2369.33 |
| 26244.0849 | 2369.33 |
| 26254.325 | 2345.85 |
| 26264.565 | 2338.5 |
| 26274.8051 | 2338.37 |
| 26285.0451 | 2338.37 |
| 26295.2851 | 2338.37 |
| 26305.5252 | 2332.84 |
| 26315.7652 | 2334.12 |
| 26326.0053 | 2334.14 |
| 26336.2453 | 2269.2 |
| 26346.4853 | 2267.99 |
| 26356.7254 | 2236.21 |
| 26366.9654 | 2241.14 |
| 26377.2055 | 2231.57 |
| 26387.4455 | 2231.39 |
| 26397.6855 | 2231.39 |
| 26407.9256 | 2231.39 |
| 26418.1656 | 2187.17 |
| 26428.4057 | 2184.96 |
| 26438.6457 | 2183.56 |
| 26448.8858 | 2183.53 |
| 26459.1258 | 2183.53 |
| 26469.3658 | 2183.53 |
| 26479.6059 | 2183.53 |
| 26489.8459 | 2171.09 |
| 26500.086 | 2170.86 |
| 26510.326 | 2169.48 |
| 26520.566 | 2169.45 |
| 26530.8061 | 2172.22 |
| 26541.0461 | 2172.27 |
| 26551.2862 | 2202.67 |
| 26561.5262 | 2203.24 |
| 26571.7663 | 2230.87 |
| 26582.0063 | 2231.39 |
| 26592.2463 | 2231.39 |
| 26602.4864 | 2253.5 |
| 26612.7264 | 2253.91 |
| 26622.9665 | 2253.91 |
| 26633.2065 | 2263.58 |
| 26643.4465 | 2263.76 |
| 26653.6866 | 2265.15 |
| 26663.9266 | 2278.99 |
| 26674.1667 | 2384.27 |
| 26684.4067 | 2379.32 |
| 26694.6468 | 2379.19 |
| 26704.8868 | 2381.95 |
| 26715.1268 | 2383.39 |
| 26725.3669 | 2383.41 |
| 26735.6069 | 2383.41 |
| 26745.847 | 2384.79 |
| 26756.087 | 2384.82 |
| 26766.327 | 2384.82 |
| 26776.5671 | 2393.11 |
| 26786.8071 | 2404.32 |
| 26797.0472 | 2404.53 |
| 26807.2872 | 2404.53 |
| 26817.5272 | 2404.53 |
| 26827.7673 | 2404.53 |
| 26838.0073 | 2404.53 |
| 26848.2474 | 2403.14 |
| 26858.4874 | 2403.12 |
| 26868.7275 | 2403.12 |
| 26878.9675 | 2392.06 |
| 26889.2075 | 2391.86 |
| 26899.4476 | 2391.86 |
| 26909.6876 | 2397.38 |
| 26919.9277 | 2397.49 |
| 26930.1677 | 2397.49 |
| 26940.4077 | 2398.87 |
| 26950.6478 | 2398.89 |
| 26960.8878 | 2401.66 |
| 26971.1279 | 2403.09 |
| 26981.3679 | 2404.5 |
| 26991.608 | 2407.29 |
| 27001.848 | 2475.06 |
| 27012.088 | 2476.31 |
| 27022.3281 | 2473.55 |
| 27032.5681 | 2473.5 |
| 27042.8082 | 2473.5 |
| 27053.0482 | 2479.03 |
| 27063.2882 | 2479.13 |
| 27073.5283 | 2479.13 |
| 27083.7683 | 2481.89 |
| 27094.0084 | 2486.09 |
| 27104.2484 | 2486.17 |
| 27114.4884 | 2490.31 |
| 27124.7285 | 2490.39 |
| 27134.9685 | 2490.39 |
| 27145.2086 | 2498.68 |
| 27155.4486 | 2497.45 |
| 27165.6887 | 2497.43 |
| 27175.9287 | 2497.43 |
| 27186.1687 | 2498.81 |
| 27196.4088 | 2498.84 |
| 27206.6488 | 2498.84 |
| 27216.8889 | 2500.22 |
| 27227.1289 | 2500.24 |
| 27237.3689 | 2503.01 |
| 27247.609 | 2503.06 |
| 27257.849 | 2507.2 |
| 27268.0891 | 2512.81 |
| 27278.3291 | 2522.59 |
| 27288.5692 | 2521.38 |
| 27298.8092 | 2521.36 |
| 27309.0492 | 2521.36 |
| 27319.2893 | 2521.36 |
| 27329.5293 | 2521.36 |
| 27339.7694 | 2525.5 |
| 27350.0094 | 2526.96 |
| 27360.2494 | 2531.13 |
| 27370.4895 | 2532.59 |
| 27380.7295 | 2542.29 |
| 27390.9696 | 2542.47 |
| 27401.2096 | 2542.47 |
| 27411.4496 | 2542.47 |
| 27421.6897 | 2542.47 |
| 27431.9297 | 2543.85 |
| 27442.1698 | 2548.03 |
| 27452.4098 | 2549.48 |
| 27462.6499 | 2550.89 |
| 27472.8899 | 2550.92 |
| 27483.1299 | 2550.92 |
| 27493.37 | 2550.92 |
| 27503.61 | 2555.06 |
| 27513.8501 | 2555.14 |
| 27524.0901 | 2560.67 |
| 27534.3301 | 2558.7 |
| 27544.5702 | 2556.59 |
| 27554.8102 | 2554.47 |
| 27565.0503 | 2552.36 |
| 27575.2903 | 2541.27 |
| 27585.5304 | 2514.8 |
| 27595.7704 | 2454.88 |
| 27606.0104 | 2449.64 |
| 27616.2505 | 2449.57 |
| 27626.4905 | 2439.89 |
| 27636.7306 | 2439.72 |
| 27646.9706 | 2439.72 |
| 27657.2106 | 2439.72 |
| 27667.4507 | 2431.42 |
| 27677.6907 | 2425.74 |
| 27687.9308 | 2425.64 |
| 27698.1708 | 2425.64 |
| 27708.4109 | 2424.26 |
| 27718.6509 | 2424.23 |
| 27728.8909 | 2424.23 |
| 27739.131 | 2425.61 |
| 27749.371 | 2425.64 |
| 27759.6111 | 2425.64 |
| 27769.8511 | 2442.23 |
| 27780.0911 | 2442.53 |
| 27790.3312 | 2442.53 |
| 27800.5712 | 2442.53 |
| 27810.8113 | 2468.8 |
| 27821.0513 | 2469.28 |
| 27831.2914 | 2469.28 |
| 27841.5314 | 2473.42 |
| 27851.7714 | 2472.12 |
| 27862.0115 | 2467.94 |
| 27872.2515 | 2495.52 |
| 27882.4916 | 2496.02 |
| 27892.7316 | 2493.25 |
| 27902.9716 | 2469.7 |
| 27913.2117 | 2467.89 |
| 27923.4517 | 2463.72 |
| 27933.6918 | 2462.26 |
| 27943.9318 | 2455.32 |
| 27954.1718 | 2462.11 |
| 27964.4119 | 2438.73 |
| 27974.6519 | 2434.16 |
| 27984.892 | 2423.02 |
| 27995.132 | 2426.97 |
| 28005.3721 | 2427.05 |
| 28015.6121 | 2413.22 |
| 28025.8521 | 2406.06 |
| 28036.0922 | 2405.93 |
| 28046.3322 | 2389.34 |
| 28056.5723 | 2387.66 |
| 28066.8123 | 2386.25 |
| 28077.0523 | 2361.34 |
| 28087.2924 | 2359.51 |
| 28097.5324 | 2342.89 |
| 28107.7725 | 2335.68 |
| 28118.0125 | 2341.08 |
| 28128.2526 | 2334.27 |
| 28138.4926 | 2305.11 |
| 28148.7326 | 2299.05 |
| 28158.9727 | 2305.87 |
| 28169.2127 | 2285.25 |
| 28179.4528 | 2277.96 |
| 28189.6928 | 2276.46 |
| 28199.9328 | 2291.64 |
| 28210.1729 | 2289.15 |
| 28220.4129 | 2286.34 |
| 28230.653 | 2291.82 |
| 28240.893 | 2289.15 |
| 28251.1331 | 2290.48 |
| 28261.3731 | 2283.59 |
| 28271.6131 | 2284.85 |
| 28281.8532 | 2290.41 |
| 28292.0932 | 2301.57 |
| 28302.3333 | 2294.86 |
| 28312.5733 | 2297.5 |
| 28322.8133 | 2300.31 |
| 28333.0534 | 2300.36 |
| 28343.2934 | 2304.51 |
| 28353.5335 | 2357.13 |
| 28363.7735 | 2363.6 |
| 28374.0136 | 2366.47 |
| 28384.2536 | 2369.28 |
| 28394.4936 | 2370.72 |
| 28404.7337 | 2372.13 |
| 28414.9737 | 2373.53 |
| 28425.2138 | 2366.64 |
| 28435.4538 | 2369.28 |
| 28445.6938 | 2332 |
| 28455.9339 | 2325.8 |
| 28466.1739 | 2298.04 |
| 28476.414 | 2304.46 |
| 28486.654 | 2304.58 |
| 28496.894 | 2286.61 |
| 28507.1341 | 2284.9 |
| 28517.3741 | 2290.41 |
| 28527.6142 | 2283.59 |
| 28537.8542 | 2271.02 |
| 28548.0943 | 2269.42 |
| 28558.3343 | 2265.25 |
| 28568.5743 | 2266.55 |
| 28578.8144 | 2266.58 |
| 28589.0544 | 2265.2 |
| 28599.2945 | 2259.64 |
| 28609.5345 | 2254.01 |
| 28619.7745 | 2259.44 |
| 28630.0146 | 2256.77 |
| 28640.2546 | 2256.73 |
| 28650.4947 | 2263.64 |
| 28660.7347 | 2270.68 |
| 28670.9748 | 2281.86 |
| 28681.2148 | 2282.06 |
| 28691.4548 | 2283.45 |
| 28701.6949 | 2313.89 |
| 28711.9349 | 2310.29 |
| 28722.175 | 2344.79 |
| 28732.415 | 2370.3 |
| 28742.655 | 2370.74 |
| 28752.8951 | 2374.89 |
| 28763.1351 | 2374.97 |
| 28773.3752 | 2374.97 |
| 28783.6152 | 2374.97 |
| 28793.8553 | 2370.82 |
| 28804.0953 | 2376.27 |
| 28814.3353 | 2376.37 |
| 28824.5754 | 2368.07 |
| 28834.8154 | 2367.93 |
| 28845.0555 | 2250.37 |
| 28855.2955 | 2248.28 |
| 28865.5355 | 2248.28 |
| 28875.7756 | 2239.98 |
| 28886.0156 | 2235.68 |
| 28896.2557 | 2234.23 |
| 28906.4957 | 2230.05 |
| 28916.7358 | 2229.98 |
| 28926.9758 | 2224.45 |
| 28937.2158 | 2217.43 |
| 28947.4559 | 2222.84 |
| 28957.6959 | 2222.94 |
| 28967.936 | 2222.94 |
| 28978.176 | 2224.33 |
| 28988.416 | 2224.35 |
| 28998.6561 | 2224.35 |
| 29008.8961 | 2224.35 |
| 29019.1362 | 2224.35 |
| 29029.3762 | 2225.73 |
| 29039.6163 | 2225.76 |
| 29049.8563 | 2240.97 |
| 29060.0963 | 2253.69 |
| 29070.3364 | 2252.53 |
| 29080.5764 | 2252.5 |
| 29090.8165 | 2260.8 |
| 29101.0565 | 2252.65 |
| 29111.2965 | 2252.5 |
| 29121.5366 | 2252.5 |
| 29131.7766 | 2249.74 |
| 29142.0167 | 2249.69 |
| 29152.2567 | 2234.47 |
| 29162.4968 | 2230.05 |
| 29172.7368 | 2229.98 |
| 29182.9768 | 2229.98 |
| 29193.2169 | 2229.98 |
| 29203.4569 | 2223.06 |
| 29213.697 | 2222.94 |
| 29223.937 | 2222.94 |
| 29234.177 | 2199.43 |
| 29244.4171 | 2199.01 |
| 29254.6571 | 2196.25 |
| 29264.8972 | 2164.38 |
| 29275.1372 | 2163.82 |
| 29285.3773 | 2162.44 |
| 29295.6173 | 2130.6 |
| 29305.8573 | 2121.74 |
| 29316.0974 | 2121.59 |
| 29326.3374 | 2114.68 |
| 29336.5775 | 2114.56 |
| 29346.8175 | 2114.56 |
| 29357.0575 | 2117.32 |
| 29367.2976 | 2117.37 |
| 29377.5376 | 2118.75 |
| 29387.7777 | 2118.78 |
| 29398.0177 | 2118.78 |
| 29408.2578 | 2121.55 |
| 29418.4978 | 2121.59 |
| 29428.7378 | 2125.74 |
| 29438.9779 | 2138.27 |
| 29449.2179 | 2137.1 |
| 29459.458 | 2138.46 |
| 29469.698 | 2163.39 |
| 29479.938 | 2169.36 |
| 29490.1781 | 2169.45 |
| 29500.4181 | 2169.45 |
| 29510.6582 | 2173.6 |
| 29520.8982 | 2176.44 |
| 29531.1383 | 2176.49 |
| 29541.3783 | 2183.41 |
| 29551.6183 | 2234.71 |
| 29561.8584 | 2268.81 |
| 29572.0984 | 2269.39 |
| 29582.3385 | 2269.39 |
| 29592.5785 | 2269.39 |
| 29602.8185 | 2269.39 |
| 29613.0586 | 2269.39 |
| 29623.2986 | 2284.61 |
| 29633.5387 | 2284.88 |
| 29643.7787 | 2284.88 |
| 29654.0188 | 2284.88 |
| 29664.2588 | 2284.88 |
| 29674.4988 | 2284.88 |
| 29684.7389 | 2207.41 |
| 29694.9789 | 2284.91 |
| 29705.219 | 2178.38 |
| 29715.459 | 2176.49 |
| 29725.699 | 2173.72 |
| 29735.9391 | 2177.83 |
| 29746.1791 | 2172.36 |
| 29756.4192 | 2179.19 |
| 29766.6592 | 2179.31 |
| 29776.8993 | 2180.69 |
| 29787.1393 | 2180.71 |
| 29797.3793 | 2182.1 |
| 29807.6194 | 2183.51 |
| 29817.8594 | 2183.53 |
| 29828.0995 | 2186.3 |
| 29838.3395 | 2186.34 |
| 29848.5795 | 2212.63 |
| 29858.8196 | 2213.09 |
| 29869.0596 | 2214.47 |
| 29879.2997 | 2214.5 |
| 29889.5397 | 2297.51 |
| 29899.7798 | 2297.57 |
| 29910.0198 | 2297.55 |
| 29920.2598 | 2296.16 |
| 29930.4999 | 2296.14 |
| 29940.7399 | 2296.14 |
| 29950.98 | 2296.14 |
| 29961.22 | 2297.52 |
| 29971.46 | 2297.55 |
| 29981.7001 | 2297.55 |
| 29991.9401 | 2261.57 |
| 30002.1802 | 2218.06 |
| 30012.4202 | 2217.31 |
| 30022.6603 | 2217.31 |
| 30032.9003 | 2207.63 |
| 30043.1403 | 2195.01 |
| 30053.3804 | 2194.79 |
| 30063.6204 | 2194.79 |
| 30073.8605 | 2194.79 |
| 30084.1005 | 2180.95 |
| 30094.3405 | 2172.41 |
| 30104.5806 | 2145.98 |
| 30114.8206 | 2145.52 |
| 30125.0607 | 2145.52 |
| 30135.3007 | 2145.52 |
| 30145.5408 | 2145.52 |
| 30155.7808 | 2139.99 |
| 30166.0208 | 2126.06 |
| 30176.2609 | 2125.82 |
| 30186.5009 | 2114.75 |
| 30196.741 | 2114.56 |
| 30206.981 | 2093.8 |
| 30217.221 | 2093.44 |
| 30227.4611 | 2080.99 |
| 30237.7011 | 2060.02 |
| 30247.9412 | 2058.28 |
| 30258.1812 | 2058.25 |
| 30268.4213 | 2058.25 |
| 30278.6613 | 2056.87 |
| 30288.9013 | 2056.84 |
| 30299.1414 | 2056.84 |
| 30309.3814 | 2059.61 |
| 30319.6215 | 2062.43 |
| 30329.8615 | 2062.47 |
| 30340.1015 | 2084.61 |
| 30350.3416 | 2085 |
| 30360.5816 | 2102.99 |
| 30370.8217 | 2124.05 |
| 30381.0617 | 2124.41 |
| 30391.3018 | 2124.41 |
| 30401.5418 | 2161.77 |
| 30411.7818 | 2181.79 |
| 30422.0219 | 2171.05 |
| 30432.2619 | 2201.3 |
| 30442.502 | 2218.43 |
| 30452.742 | 2218.72 |
| 30462.982 | 2220.1 |
| 30473.2221 | 2296.24 |
| 30483.4621 | 2297.55 |
| 30493.7022 | 2305.85 |
| 30503.9422 | 2305.99 |
| 30514.1823 | 2305.99 |
| 30524.4223 | 2305.99 |
| 30534.6623 | 2312.91 |
| 30544.9024 | 2313.03 |
| 30555.1424 | 2322.72 |
| 30565.3825 | 2322.88 |
| 30575.6225 | 2324.27 |
| 30585.8625 | 2324.29 |
| 30596.1026 | 2333.98 |
| 30606.3426 | 2335.53 |
| 30616.5827 | 2335.55 |
| 30626.8227 | 2335.55 |
| 30637.0628 | 2335.55 |
| 30647.3028 | 2336.94 |
| 30657.5428 | 2339.73 |
| 30667.7829 | 2303.79 |
| 30678.0229 | 2296.26 |
| 30688.263 | 2217.25 |
| 30698.503 | 2215.9 |
| 30708.743 | 2215.9 |
| 30718.9831 | 2179.92 |
| 30729.2231 | 2179.31 |
| 30739.4632 | 2179.31 |
| 30749.7032 | 2179.31 |
| 30759.9433 | 2197.3 |
| 30770.1833 | 2197.61 |
| 30780.4233 | 2197.61 |
| 30790.6634 | 2197.61 |
| 30800.9034 | 2198.99 |
| 30811.1435 | 2200.4 |
| 30821.3835 | 2208.72 |
| 30831.6235 | 2208.87 |
| 30841.8636 | 2221.32 |
| 30852.1036 | 2225.69 |
| 30862.3437 | 2225.76 |
| 30872.5837 | 2243.75 |
| 30882.8238 | 2314.64 |
| 30893.0638 | 2325.53 |
| 30903.3038 | 2325.7 |
| 30913.5439 | 2324.31 |
| 30923.7839 | 2328.44 |
| 30934.024 | 2336.82 |
| 30944.264 | 2336.96 |
| 30954.504 | 2360.49 |
| 30964.7441 | 2362.27 |
| 30974.9841 | 2362.3 |
| 30985.2242 | 2362.3 |
| 30995.4642 | 2362.3 |
| 31005.7043 | 2362.3 |
| 31015.9443 | 2363.68 |
| 31026.1843 | 2363.7 |
| 31036.4244 | 2324.95 |
| 31046.6644 | 2309.07 |
| 31056.9045 | 2308.81 |
| 31067.1445 | 2289.43 |
| 31077.3845 | 2289.1 |
| 31087.6246 | 2289.1 |
| 31097.8646 | 2232.35 |
| 31108.1047 | 2230 |
| 31118.3447 | 2227.21 |
| 31128.5848 | 2217.48 |
| 31138.8248 | 2217.31 |
| 31149.0648 | 2215.93 |
| 31159.3049 | 2215.9 |
| 31169.5449 | 2214.52 |
| 31179.785 | 2214.5 |
| 31190.025 | 2211.73 |
| 31200.2651 | 2211.68 |
| 31210.5051 | 2213.07 |
| 31220.7451 | 2214.47 |
| 31230.9852 | 2214.5 |
| 31241.2252 | 2316.93 |
| 31251.4653 | 2318.66 |
| 31261.7053 | 2318.66 |
| 31271.9453 | 2320.04 |
| 31282.1854 | 2321.45 |
| 31292.4254 | 2321.48 |
| 31302.6655 | 2322.86 |
| 31312.9055 | 2322.88 |
| 31323.1456 | 2328.42 |
| 31333.3856 | 2328.51 |
| 31343.6256 | 2328.51 |
| 31353.8657 | 2336.82 |
| 31364.1057 | 2331.42 |
| 31374.3458 | 2350.71 |
| 31384.5858 | 2351.04 |
| 31394.8258 | 2351.04 |
| 31405.0659 | 2352.42 |
| 31415.3059 | 2356.6 |
| 31425.546 | 2356.67 |
| 31435.786 | 2373.28 |
| 31446.0261 | 2372.17 |
| 31456.2661 | 2373.53 |
| 31466.5061 | 2409.55 |
| 31476.7462 | 2414.31 |
| 31486.9862 | 2419.92 |
| 31497.2263 | 2420.01 |
| 31507.4663 | 2420.01 |
| 31517.7063 | 2417.24 |
| 31527.9464 | 2417.19 |
| 31538.1864 | 2424.12 |
| 31548.4265 | 2424.23 |
| 31558.6665 | 2435.31 |
| 31568.9066 | 2456.26 |
| 31579.1466 | 2456.61 |
| 31589.3866 | 2456.61 |
| 31599.6267 | 2456.61 |
| 31609.8667 | 2456.61 |
| 31620.1068 | 2456.61 |
| 31630.3468 | 2457.99 |
| 31640.5868 | 2460.78 |
| 31650.8269 | 2460.83 |
| 31661.0669 | 2460.83 |
| 31671.307 | 2460.83 |
| 31681.547 | 2488.52 |
| 31691.7871 | 2486.21 |
| 31702.0271 | 2486.17 |
| 31712.2671 | 2491.7 |
| 31722.5072 | 2491.8 |
| 31732.7472 | 2493.18 |
| 31742.9873 | 2493.2 |
| 31753.2273 | 2493.2 |
| 31763.4674 | 2498.74 |
| 31773.7074 | 2505.76 |
| 31783.9474 | 2505.87 |
| 31794.1875 | 2508.64 |
| 31804.4275 | 2508.69 |
| 31814.6676 | 2508.69 |
| 31824.9076 | 2521.15 |
| 31835.1476 | 2511.67 |
| 31845.3877 | 2512.89 |
| 31855.6277 | 2512.91 |
| 31865.8678 | 2512.91 |
| 31876.1078 | 2512.91 |
| 31886.3479 | 2512.91 |
| 31896.5879 | 2512.91 |
| 31906.8279 | 2523.99 |
| 31917.068 | 2526.94 |
| 31927.308 | 2525.6 |
| 31937.5481 | 2522.81 |
| 31947.7881 | 2521.38 |
| 31958.0281 | 2521.36 |
| 31968.2682 | 2521.36 |
| 31978.5082 | 2521.36 |
| 31988.7483 | 2531.05 |
| 31998.9883 | 2531.21 |
| 32009.2284 | 2528.44 |
| 32019.4684 | 2528.4 |
| 32029.7084 | 2528.4 |
| 32039.9485 | 2528.4 |
| 32050.1885 | 2528.4 |
| 32060.4286 | 2524.24 |
| 32070.6686 | 2524.17 |
| 32080.9086 | 2522.79 |
| 32091.1487 | 2522.76 |
| 32101.3887 | 2522.76 |
| 32111.6288 | 2520 |
| 32121.8688 | 2519.95 |
| 32132.1089 | 2519.95 |
| 32142.3489 | 2522.72 |
| 32152.5889 | 2522.76 |
| 32162.829 | 2522.76 |
| 32173.069 | 2525.53 |
| 32183.3091 | 2525.58 |
| 32193.5491 | 2521.43 |
| 32203.7892 | 2529.67 |
| 32214.0292 | 2524.26 |
| 32224.2692 | 2524.17 |
| 32234.5093 | 2524.17 |
| 32244.7493 | 2525.56 |
| 32254.9894 | 2525.58 |
| 32265.2294 | 2525.58 |
| 32275.4694 | 2524.2 |
| 32285.7095 | 2524.17 |
| 32295.9495 | 2525.56 |
| 32306.1896 | 2525.58 |
| 32316.4296 | 2525.58 |
| 32326.6697 | 2525.58 |
| 32336.9097 | 2526.96 |
| 32347.1497 | 2526.99 |
| 32357.3898 | 2520.06 |
| 32367.6298 | 2519.95 |
| 32377.8699 | 2519.95 |
| 32388.1099 | 2519.95 |
| 32398.3499 | 2515.8 |
| 32408.59 | 2515.73 |
| 32418.83 | 2511.57 |
| 32429.0701 | 2508.73 |
| 32439.3101 | 2507.3 |
| 32449.5502 | 2505.9 |
| 32459.7902 | 2505.87 |
| 32470.0302 | 2505.87 |
| 32480.2703 | 2483.72 |
| 32490.5103 | 2476.43 |
| 32500.7504 | 2483.24 |
| 32510.9904 | 2476.43 |
| 32521.2304 | 2470.77 |
| 32531.4705 | 2470.68 |
| 32541.2842 | 2470.68 |